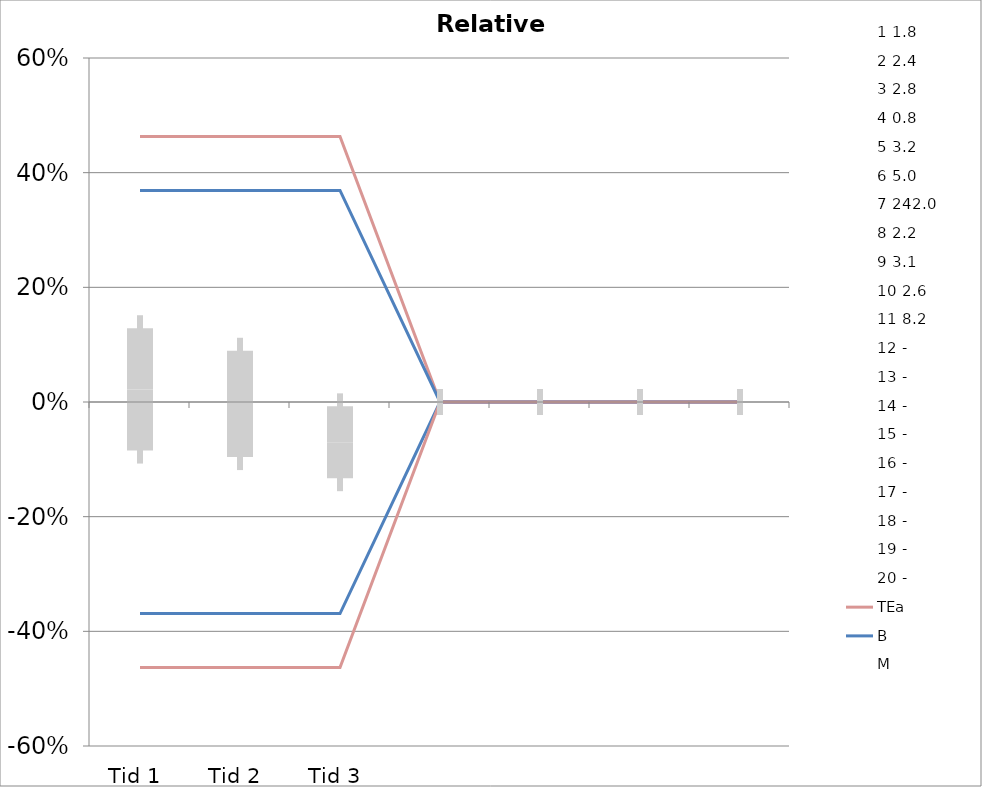
| Category | 1 | 2 | 3 | 4 | 5 | 6 | 7 | 8 | 9 | 10 | 11 | 12 | 13 | 14 | 15 | 16 | 17 | 18 | 19 | 20 | TEa | B | -B | -TEa | M |
|---|---|---|---|---|---|---|---|---|---|---|---|---|---|---|---|---|---|---|---|---|---|---|---|---|---|
| Tid 1 | 0.444 | -0.083 | -0.071 | 0 | -0.094 | -0.1 | -0.031 | -0.045 | 0.032 | 0.154 | 0.037 | 0 | 0 | 0 | 0 | 0 | 0 | 0 | 0 | 0 | 0.463 | 0.369 | -0.369 | -0.463 | 0.022 |
| Tid 2 | -0.222 | 0.208 | -0.036 | 0 | -0.031 | 0 | 0.01 | 0.091 | -0.097 | -0.115 | 0.159 | 0 | 0 | 0 | 0 | 0 | 0 | 0 | 0 | 0 | 0.463 | 0.369 | -0.369 | -0.463 | -0.003 |
| Tid 3 | -0.278 | -0.083 | -0.143 | 0 | -0.062 | -0.04 | -0.005 | -0.091 | 0 | 0 | 0 | 0 | 0 | 0 | 0 | 0 | 0 | 0 | 0 | 0 | 0.463 | 0.369 | -0.369 | -0.463 | -0.07 |